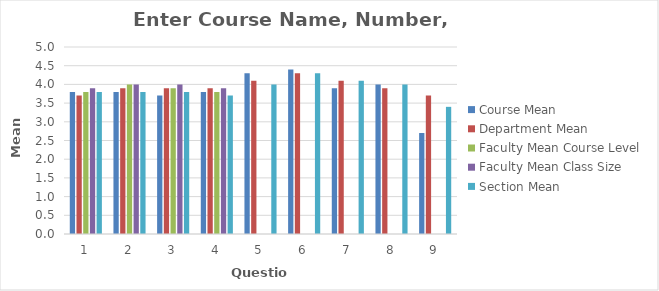
| Category | Course Mean | Department Mean | Faculty Mean Course Level | Faculty Mean Class Size | Section Mean |
|---|---|---|---|---|---|
| 0 | 3.8 | 3.7 | 3.8 | 3.9 | 3.8 |
| 1 | 3.8 | 3.9 | 4 | 4 | 3.8 |
| 2 | 3.7 | 3.9 | 3.9 | 4 | 3.8 |
| 3 | 3.8 | 3.9 | 3.8 | 3.9 | 3.7 |
| 4 | 4.3 | 4.1 | 0 | 0 | 4 |
| 5 | 4.4 | 4.3 | 0 | 0 | 4.3 |
| 6 | 3.9 | 4.1 | 0 | 0 | 4.1 |
| 7 | 4 | 3.9 | 0 | 0 | 4 |
| 8 | 2.7 | 3.7 | 0 | 0 | 3.4 |